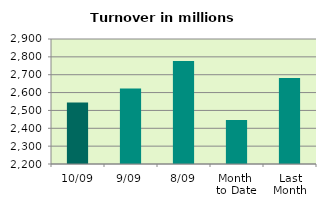
| Category | Series 0 |
|---|---|
| 10/09 | 2545.074 |
| 9/09 | 2622.667 |
| 8/09 | 2776.151 |
| Month 
to Date | 2446.78 |
| Last
Month | 2681.097 |